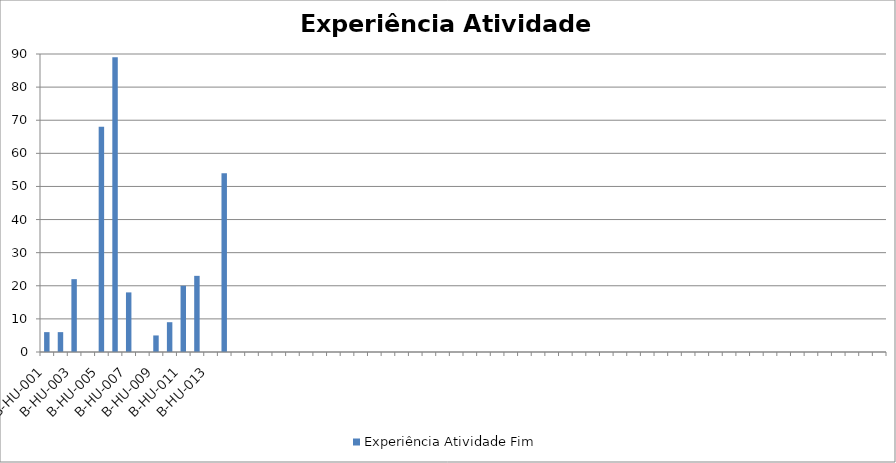
| Category | Experiência Atividade Fim |
|---|---|
| B-HU-001 | 6 |
| B-HU-002 | 6 |
| B-HU-003 | 22 |
| B-HU-004 | 0 |
| B-HU-005 | 68 |
| B-HU-006 | 89 |
| B-HU-007 | 18 |
| B-HU-008 | 0 |
| B-HU-009 | 5 |
| B-HU-010 | 9 |
| B-HU-011 | 20 |
| B-HU-012 | 23 |
| B-HU-013 | 0 |
| B-HU-014 | 54 |